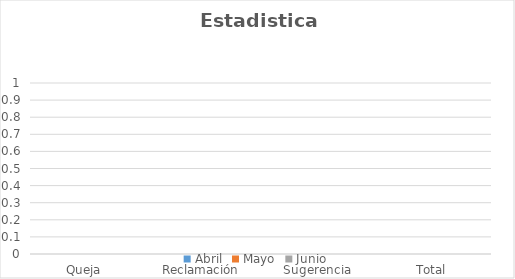
| Category | Abril | Mayo | Junio |
|---|---|---|---|
| Queja  | 0 | 0 | 0 |
| Reclamación | 0 | 0 | 0 |
| Sugerencia | 0 | 0 | 0 |
| Total | 0 | 0 | 0 |